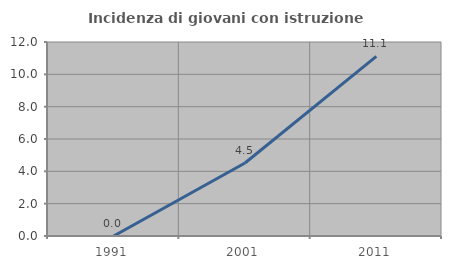
| Category | Incidenza di giovani con istruzione universitaria |
|---|---|
| 1991.0 | 0 |
| 2001.0 | 4.516 |
| 2011.0 | 11.111 |